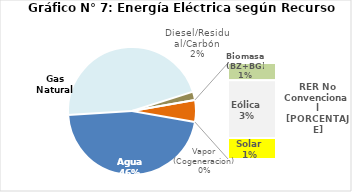
| Category | Series 0 |
|---|---|
| Agua | 2180.434 |
| Gas Natural | 2172.57 |
| Diesel/Residual/Carbón | 99.988 |
| Vapor (Cogeneracion) | 0.338 |
| Biomasa (BZ+BG) | 46.964 |
| Eólica | 157.234 |
| Solar | 57.34 |